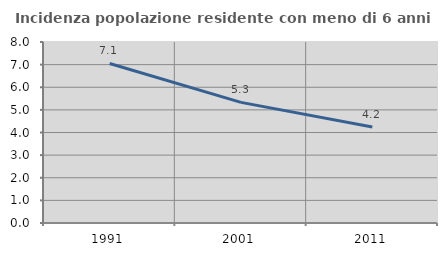
| Category | Incidenza popolazione residente con meno di 6 anni |
|---|---|
| 1991.0 | 7.052 |
| 2001.0 | 5.331 |
| 2011.0 | 4.243 |